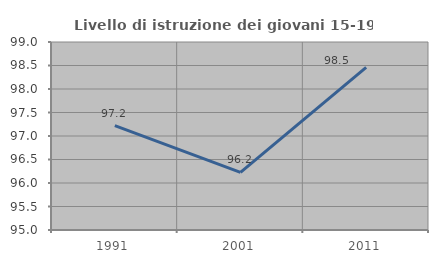
| Category | Livello di istruzione dei giovani 15-19 anni |
|---|---|
| 1991.0 | 97.222 |
| 2001.0 | 96.226 |
| 2011.0 | 98.462 |